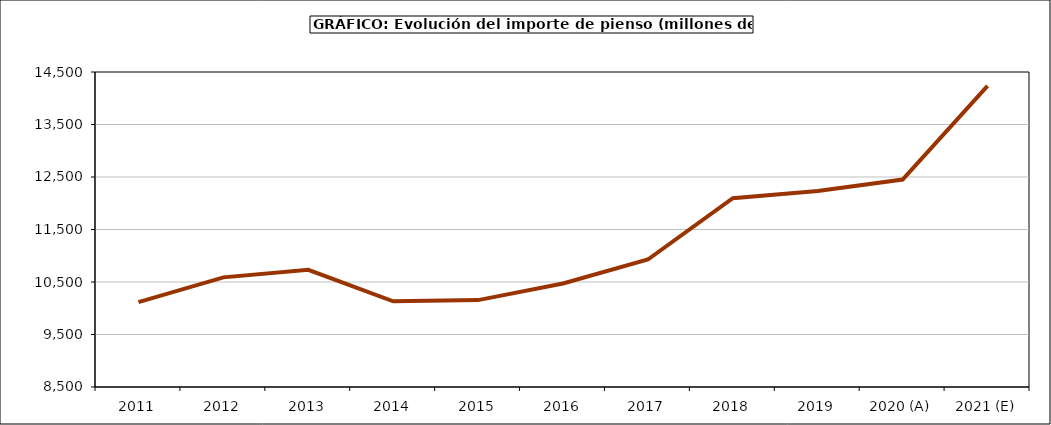
| Category | piensos |
|---|---|
| 2011 | 10115.595 |
| 2012 | 10588.115 |
| 2013 | 10733.318 |
| 2014 | 10132.591 |
| 2015 | 10154.98 |
| 2016 | 10470.8 |
| 2017 | 10928.619 |
| 2018 | 12095.55 |
| 2019 | 12231.73 |
| 2020 (A) | 12450.727 |
| 2021 (E) | 14235.097 |